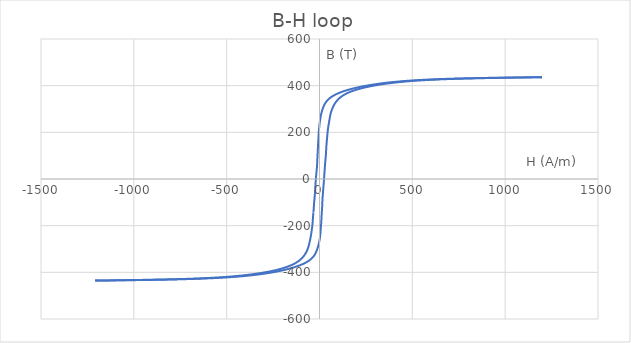
| Category | B-H loop |
|---|---|
| -33.14 | -143.5 |
| -34.29 | -156.1 |
| -35.38 | -168.7 |
| -36.51 | -181.2 |
| -37.91 | -193.5 |
| -39.55 | -205.8 |
| -41.52 | -218 |
| -43.7 | -230 |
| -46.17 | -241.9 |
| -48.91 | -253.7 |
| -51.84 | -265.4 |
| -55.1 | -276.8 |
| -58.7 | -288 |
| -63.25 | -299 |
| -68.88 | -309.9 |
| -76.14 | -320.4 |
| -85.03 | -330.7 |
| -96.14 | -340.7 |
| -109.9 | -350.3 |
| -127.1 | -359.4 |
| -148.2 | -368.1 |
| -173.4 | -376.2 |
| -202.9 | -383.8 |
| -236.7 | -390.9 |
| -275.0 | -397.4 |
| -317.6 | -403.3 |
| -364.3 | -408.7 |
| -415.1 | -413.4 |
| -469.8 | -417.6 |
| -528.7 | -421.1 |
| -590.8 | -423.9 |
| -655.1 | -426.3 |
| -720.0 | -428.1 |
| -784.2 | -429.6 |
| -845.9 | -430.7 |
| -904.0 | -431.6 |
| -957.9 | -432.4 |
| -1007.0 | -433 |
| -1051.0 | -433.5 |
| -1089.0 | -434 |
| -1122.0 | -434.4 |
| -1150.0 | -434.6 |
| -1172.0 | -434.9 |
| -1189.0 | -435 |
| -1201.0 | -435.1 |
| -1208.0 | -435.2 |
| -1210.0 | -435.3 |
| -1208.0 | -435.3 |
| -1200.0 | -435.2 |
| -1189.0 | -435.2 |
| -1173.0 | -435.1 |
| -1153.0 | -434.9 |
| -1129.0 | -434.8 |
| -1101.0 | -434.5 |
| -1070.0 | -434.3 |
| -1036.0 | -433.9 |
| -998.7 | -433.5 |
| -958.7 | -433.1 |
| -916.6 | -432.6 |
| -872.3 | -431.9 |
| -826.0 | -431.2 |
| -778.0 | -430.4 |
| -729.1 | -429.4 |
| -680.1 | -428.3 |
| -631.5 | -426.9 |
| -583.6 | -425.3 |
| -537.0 | -423.5 |
| -492.0 | -421.3 |
| -448.9 | -418.9 |
| -407.9 | -416.1 |
| -369.0 | -412.9 |
| -332.1 | -409.5 |
| -297.3 | -405.7 |
| -264.6 | -401.7 |
| -233.8 | -397.3 |
| -204.8 | -392.6 |
| -177.4 | -387.5 |
| -152.2 | -382.1 |
| -128.8 | -376.4 |
| -107.5 | -370.3 |
| -88.2 | -363.9 |
| -71.27 | -357.1 |
| -56.75 | -349.9 |
| -44.72 | -342.4 |
| -34.86 | -334.4 |
| -27.09 | -326.2 |
| -20.9 | -317.6 |
| -15.97 | -308.7 |
| -11.76 | -299.5 |
| -8.07 | -290.1 |
| -4.77 | -280.4 |
| -1.87 | -270.6 |
| 0.55 | -260.4 |
| 2.55 | -250.1 |
| 4.12 | -239.5 |
| 5.33 | -228.8 |
| 6.38 | -217.8 |
| 7.42 | -206.7 |
| 8.58 | -195.4 |
| 9.54 | -183.9 |
| 10.37 | -172.3 |
| 11.08 | -160.5 |
| 11.98 | -148.6 |
| 12.97 | -136.6 |
| 13.95 | -124.4 |
| 14.76 | -112.2 |
| 15.34 | -99.8 |
| 16.07 | -87.37 |
| 17.02 | -74.9 |
| 18.31 | -62.34 |
| 19.56 | -49.71 |
| 20.86 | -37.01 |
| 22.19 | -24.29 |
| 23.42 | -11.5 |
| 24.51 | 1.32 |
| 25.51 | 14.16 |
| 26.71 | 27.06 |
| 27.87 | 39.97 |
| 29.06 | 52.88 |
| 30.27 | 65.79 |
| 31.74 | 78.7 |
| 33.22 | 91.56 |
| 34.46 | 104.4 |
| 35.36 | 117.2 |
| 36.21 | 129.9 |
| 37.15 | 142.6 |
| 38.44 | 155.2 |
| 39.87 | 167.8 |
| 41.34 | 180.3 |
| 42.71 | 192.7 |
| 44.16 | 205 |
| 45.99 | 217.2 |
| 48.28 | 229.3 |
| 50.88 | 241.2 |
| 53.44 | 253.1 |
| 55.89 | 264.7 |
| 58.68 | 276.2 |
| 62.37 | 287.5 |
| 67.25 | 298.6 |
| 73.17 | 309.4 |
| 80.13 | 320.1 |
| 88.63 | 330.4 |
| 99.21 | 340.4 |
| 112.4 | 350.1 |
| 128.9 | 359.3 |
| 149.2 | 368.1 |
| 174.2 | 376.3 |
| 203.7 | 384 |
| 237.4 | 391.1 |
| 275.0 | 397.6 |
| 316.4 | 403.6 |
| 361.9 | 409 |
| 411.6 | 413.8 |
| 465.4 | 418 |
| 523.4 | 421.6 |
| 584.7 | 424.5 |
| 648.3 | 426.9 |
| 712.6 | 428.8 |
| 776.1 | 430.3 |
| 837.5 | 431.5 |
| 895.4 | 432.4 |
| 949.0 | 433.2 |
| 997.6 | 433.9 |
| 1041.0 | 434.4 |
| 1080.0 | 434.9 |
| 1113.0 | 435.2 |
| 1140.0 | 435.5 |
| 1163.0 | 435.8 |
| 1180.0 | 435.9 |
| 1191.0 | 436.1 |
| 1198.0 | 436.2 |
| 1200.0 | 436.2 |
| 1198.0 | 436.2 |
| 1190.0 | 436.2 |
| 1179.0 | 436.1 |
| 1164.0 | 436 |
| 1144.0 | 435.9 |
| 1121.0 | 435.7 |
| 1094.0 | 435.5 |
| 1063.0 | 435.2 |
| 1029.0 | 434.8 |
| 992.1 | 434.4 |
| 952.4 | 433.9 |
| 910.1 | 433.4 |
| 865.6 | 432.7 |
| 819.5 | 432 |
| 772.4 | 431.1 |
| 724.5 | 430.1 |
| 676.2 | 429 |
| 627.9 | 427.6 |
| 580.4 | 425.9 |
| 534.5 | 424 |
| 490.2 | 421.8 |
| 447.7 | 419.3 |
| 406.9 | 416.4 |
| 368.3 | 413.3 |
| 332.1 | 409.8 |
| 298.0 | 405.9 |
| 265.7 | 401.8 |
| 235.1 | 397.4 |
| 206.1 | 392.6 |
| 179.0 | 387.5 |
| 153.6 | 382.1 |
| 130.3 | 376.3 |
| 109.3 | 370.2 |
| 90.59 | 363.7 |
| 74.14 | 356.9 |
| 60.12 | 349.7 |
| 48.52 | 342.1 |
| 39.15 | 334.2 |
| 31.68 | 325.9 |
| 25.66 | 317.4 |
| 20.66 | 308.5 |
| 16.38 | 299.3 |
| 12.75 | 289.9 |
| 9.59 | 280.3 |
| 6.93 | 270.4 |
| 4.55 | 260.3 |
| 2.59 | 250 |
| 0.86 | 239.4 |
| -0.67 | 228.7 |
| -2.06 | 217.8 |
| -3.28 | 206.7 |
| -4.15 | 195.5 |
| -4.93 | 184 |
| -5.67 | 172.4 |
| -6.6 | 160.7 |
| -7.53 | 148.8 |
| -8.33 | 136.8 |
| -9.07 | 124.6 |
| -9.85 | 112.4 |
| -10.74 | 100.1 |
| -11.45 | 87.68 |
| -12.07 | 75.21 |
| -12.8 | 62.65 |
| -13.93 | 50.03 |
| -15.35 | 37.34 |
| -16.86 | 24.59 |
| -18.28 | 11.81 |
| -19.62 | -1.02 |
| -20.84 | -13.87 |
| -21.96 | -26.73 |
| -22.84 | -39.63 |
| -23.85 | -52.51 |
| -24.94 | -65.38 |
| -26.41 | -78.26 |
| -27.76 | -91.11 |
| -29.13 | -103.9 |
| -31.53 | -132.1 |
| -31.63 | -133.3 |
| -31.73 | -134.6 |
| -31.82 | -135.9 |
| -31.91 | -137.1 |
| -31.99 | -138.4 |
| -32.08 | -139.7 |
| -32.17 | -140.9 |
| -32.25 | -142.2 |